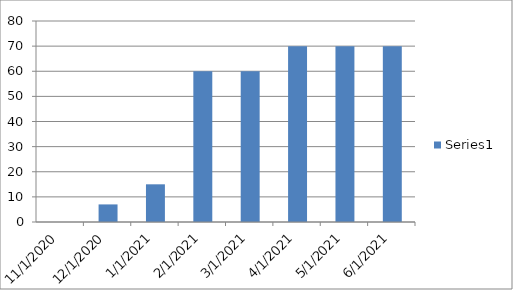
| Category | Series 0 |
|---|---|
| 11/5/20 | 0 |
| 12/5/20 | 7 |
| 1/15/21 | 15 |
| 2/15/21 | 60 |
| 3/15/21 | 60 |
| 4/15/21 | 70 |
| 5/15/21 | 70 |
| 6/15/21 | 70 |